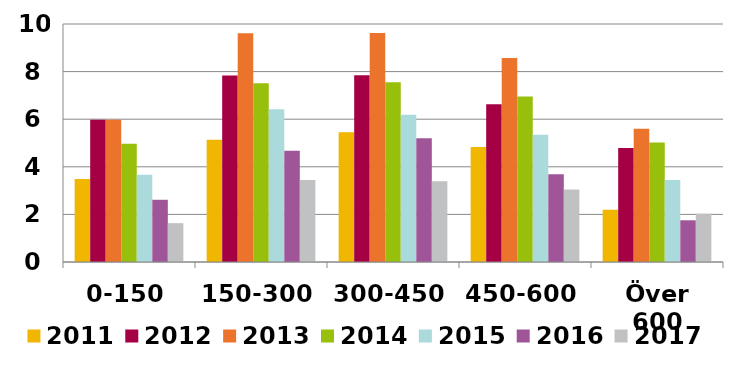
| Category | 2011 | 2012 | 2013 | 2014 | 2015 | 2016 | 2017 |
|---|---|---|---|---|---|---|---|
| 0-150 | 3.485 | 5.975 | 5.979 | 4.972 | 3.666 | 2.614 | 1.632 |
| 150-300 | 5.133 | 7.836 | 9.61 | 7.515 | 6.423 | 4.678 | 3.446 |
| 300-450 | 5.449 | 7.846 | 9.621 | 7.55 | 6.183 | 5.199 | 3.395 |
| 450-600 | 4.832 | 6.624 | 8.569 | 6.953 | 5.35 | 3.691 | 3.045 |
| Över 600 | 2.191 | 4.786 | 5.598 | 5.018 | 3.448 | 1.752 | 2.031 |